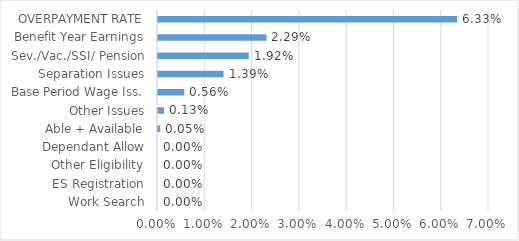
| Category | Series 0 |
|---|---|
| Work Search | 0 |
| ES Registration | 0 |
| Other Eligibility | 0 |
| Dependant Allow | 0 |
| Able + Available | 0 |
| Other Issues | 0.001 |
| Base Period Wage Iss. | 0.006 |
| Separation Issues | 0.014 |
| Sev./Vac./SSI/ Pension | 0.019 |
| Benefit Year Earnings | 0.023 |
| OVERPAYMENT RATE | 0.063 |